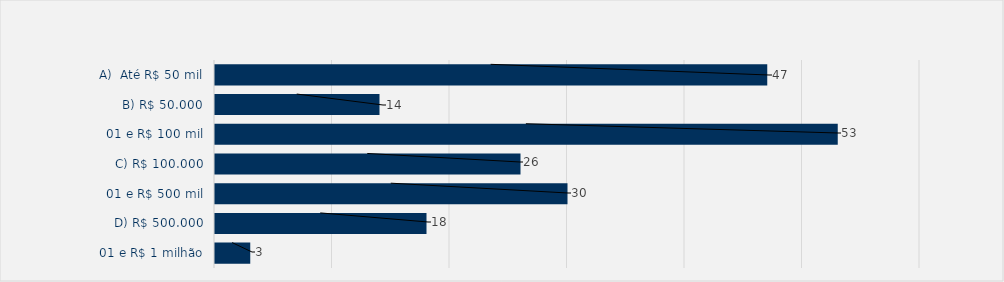
| Category | Total |
|---|---|
| A)  Até R$ 50 mil | 47 |
| B) R$ 50.000,01 e R$ 100 mil | 14 |
| C) R$ 100.000,01 e R$ 500 mil | 53 |
| D) R$ 500.000,01 e R$ 1 milhão | 26 |
| E) R$ 1.000.000,01 e R$ 5 milhões | 30 |
| F)  Superior a R$ 5 milhões | 18 |
| Sem valor autorizado | 3 |